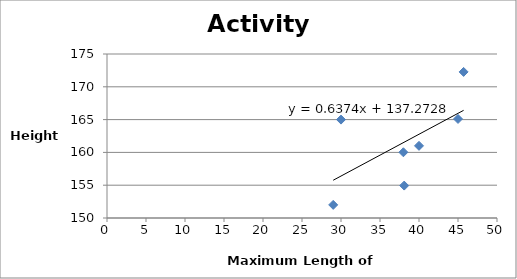
| Category | Series 0 |
|---|---|
| 38.0 | 160.02 |
| 45.0 | 165.1 |
| 45.72 | 172.27 |
| 38.1 | 154.94 |
| 30.0 | 165 |
| 40.0 | 161 |
| 29.0 | 152 |